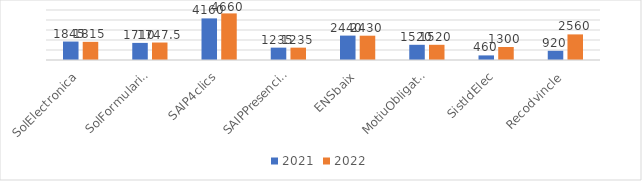
| Category | 2021 | 2022 |
|---|---|---|
| SolElectronica | 1845 | 1815 |
| SolFormulariSAIP | 1710 | 1747.5 |
| SAIP4clics | 4160 | 4660 |
| SAIPPresencial | 1235 | 1235 |
|  ENSbaix | 2440 | 2430 |
| MotiuObligatori | 1520 | 1520 |
| SistIdElec | 460 | 1300 |
| Recodvincle | 920 | 2560 |